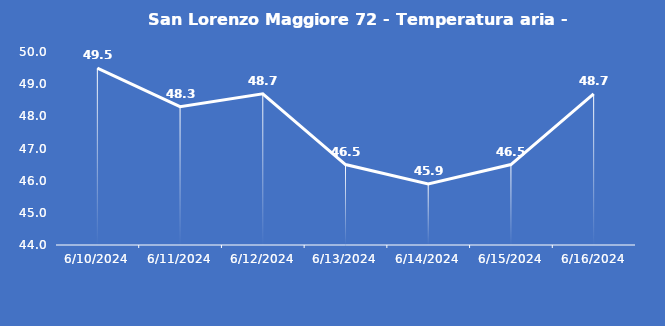
| Category | San Lorenzo Maggiore 72 - Temperatura aria - Grezzo (°C) |
|---|---|
| 6/10/24 | 49.5 |
| 6/11/24 | 48.3 |
| 6/12/24 | 48.7 |
| 6/13/24 | 46.5 |
| 6/14/24 | 45.9 |
| 6/15/24 | 46.5 |
| 6/16/24 | 48.7 |